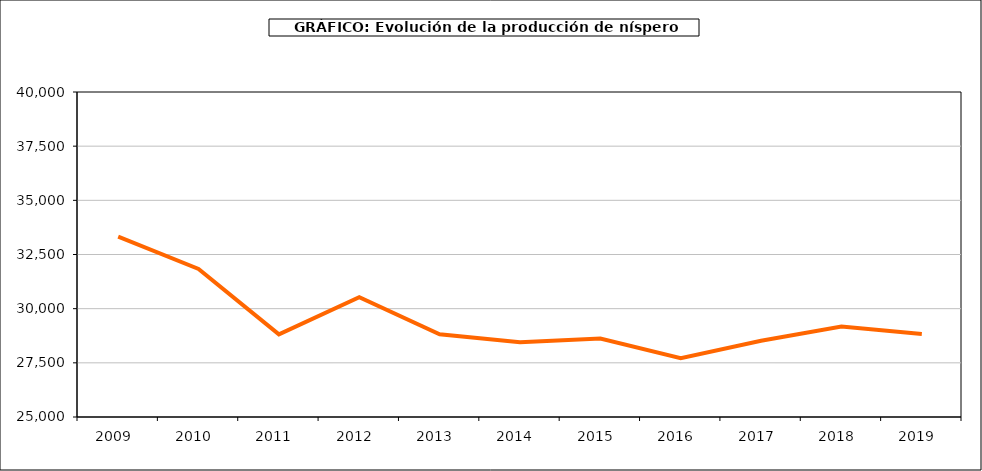
| Category | producción níspero |
|---|---|
| 2009.0 | 33328 |
| 2010.0 | 31834 |
| 2011.0 | 28812 |
| 2012.0 | 30529 |
| 2013.0 | 28815 |
| 2014.0 | 28449 |
| 2015.0 | 28620 |
| 2016.0 | 27712 |
| 2017.0 | 28522 |
| 2018.0 | 29173 |
| 2019.0 | 28836 |